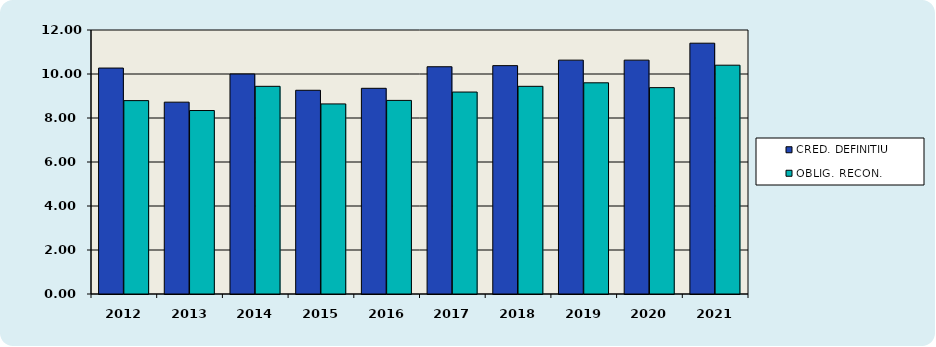
| Category | CRED. DEFINITIU | OBLIG. RECON. |
|---|---|---|
| 2012.0 | 10.27 | 8.79 |
| 2013.0 | 8.72 | 8.34 |
| 2014.0 | 10 | 9.44 |
| 2015.0 | 9.26 | 8.64 |
| 2016.0 | 9.35 | 8.8 |
| 2017.0 | 10.33 | 9.18 |
| 2018.0 | 10.38 | 9.44 |
| 2019.0 | 10.63 | 9.6 |
| 2020.0 | 10.63 | 9.38 |
| 2021.0 | 11.4 | 10.4 |